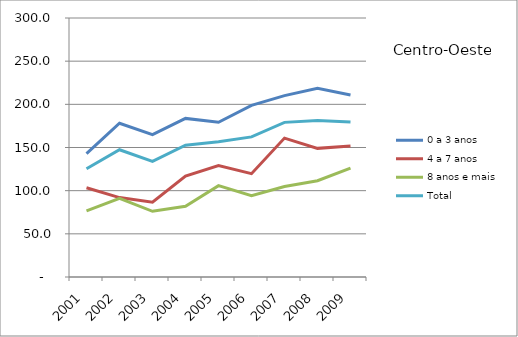
| Category | 0 a 3 anos | 4 a 7 anos | 8 anos e mais | Total |
|---|---|---|---|---|
| 2001.0 | 143 | 103.4 | 76.6 | 125.3 |
| 2002.0 | 178.1 | 92 | 91 | 147.4 |
| 2003.0 | 165 | 86.6 | 76.1 | 133.9 |
| 2004.0 | 183.7 | 117 | 82 | 152.6 |
| 2005.0 | 179.2 | 129 | 105.8 | 156.7 |
| 2006.0 | 198.8 | 119.7 | 94.2 | 162.3 |
| 2007.0 | 210.1 | 160.9 | 104.9 | 179.1 |
| 2008.0 | 218.7 | 149 | 111.5 | 181.4 |
| 2009.0 | 210.9 | 151.7 | 126.2 | 179.5 |